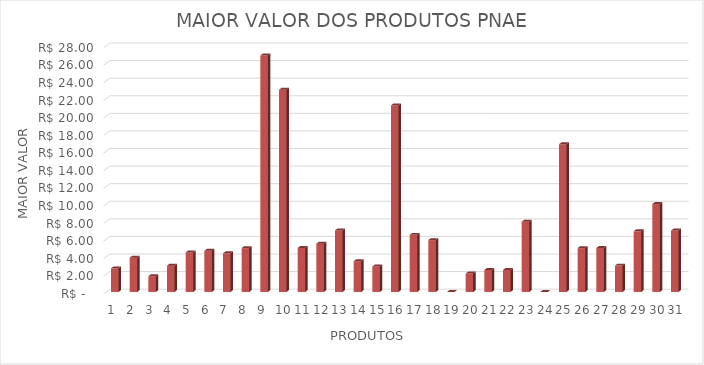
| Category | Series 0 |
|---|---|
| 0 | 2.69 |
| 1 | 3.9 |
| 2 | 1.79 |
| 3 | 2.99 |
| 4 | 4.5 |
| 5 | 4.69 |
| 6 | 4.4 |
| 7 | 4.99 |
| 8 | 26.9 |
| 9 | 23 |
| 10 | 5 |
| 11 | 5.49 |
| 12 | 7 |
| 13 | 3.5 |
| 14 | 2.9 |
| 15 | 21.22 |
| 16 | 6.5 |
| 17 | 5.9 |
| 18 | 0 |
| 19 | 2.1 |
| 20 | 2.5 |
| 21 | 2.5 |
| 22 | 7.99 |
| 23 | 0 |
| 24 | 16.8 |
| 25 | 4.99 |
| 26 | 5 |
| 27 | 3 |
| 28 | 6.9 |
| 29 | 10 |
| 30 | 6.99 |